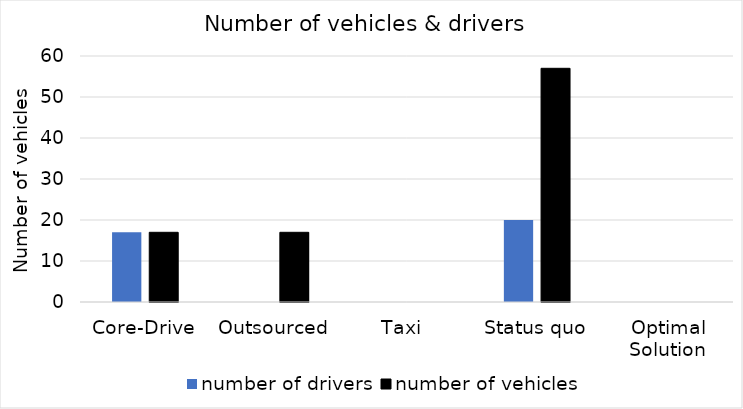
| Category | number of drivers | number of vehicles  |
|---|---|---|
| Core-Drive | 17 | 17 |
| Outsourced | 0 | 17 |
| Taxi  | 0 | 0 |
| Status quo | 20 | 57 |
| Optimal Solution | 0 | 0 |